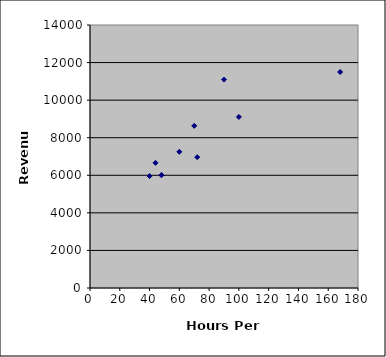
| Category | Series 0 |
|---|---|
| 40.0 | 5958 |
| 44.0 | 6662 |
| 48.0 | 6004 |
| 48.0 | 6011 |
| 60.0 | 7250 |
| 70.0 | 8632 |
| 72.0 | 6964 |
| 90.0 | 11097 |
| 100.0 | 9107 |
| 168.0 | 11498 |